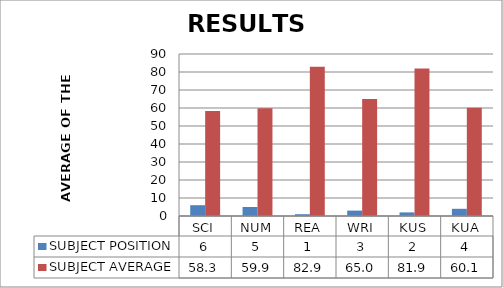
| Category | SUBJECT POSITION  | SUBJECT AVERAGE |
|---|---|---|
| SCI | 6 | 58.321 |
| NUM | 5 | 59.929 |
| REA | 1 | 82.857 |
| WRI | 3 | 65.036 |
| KUS | 2 | 81.929 |
| KUA | 4 | 60.107 |